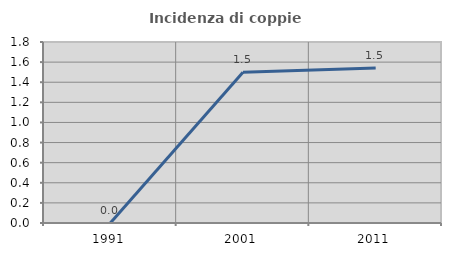
| Category | Incidenza di coppie miste |
|---|---|
| 1991.0 | 0 |
| 2001.0 | 1.5 |
| 2011.0 | 1.542 |